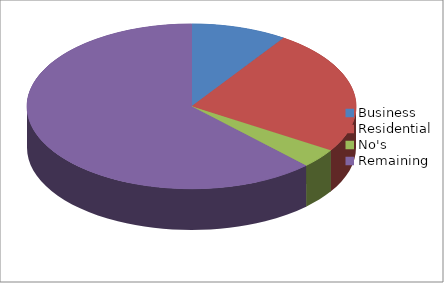
| Category | Series 0 |
|---|---|
| Business | 5 |
| Residential | 13 |
| No's | 2 |
| Remaining  | 33 |